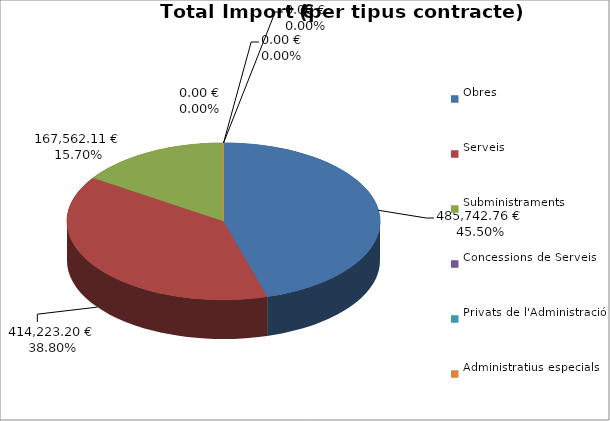
| Category | Total preu
(amb IVA) |
|---|---|
| Obres | 485742.76 |
| Serveis | 414223.2 |
| Subministraments | 167562.11 |
| Concessions de Serveis | 0 |
| Privats de l'Administració | 0 |
| Administratius especials | 0 |